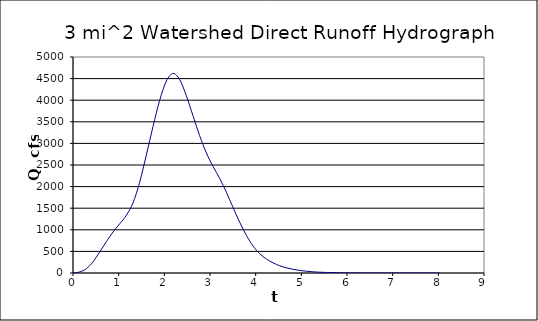
| Category | Series 0 |
|---|---|
| 0.0 | 0 |
| 0.146 | 24.152 |
| 0.292 | 99.024 |
| 0.438 | 258.428 |
| 0.584 | 483.043 |
| 0.73 | 724.564 |
| 0.876 | 949.179 |
| 1.022 | 1137.566 |
| 1.168 | 1335.187 |
| 1.314 | 1622.726 |
| 1.46 | 2101.989 |
| 1.606 | 2732.019 |
| 1.752 | 3391.217 |
| 1.898 | 3997.094 |
| 2.044 | 4442.36 |
| 2.19 | 4619.495 |
| 2.336 | 4477.637 |
| 2.4819999999999998 | 4103.023 |
| 2.628 | 3639.079 |
| 2.774 | 3178.132 |
| 2.92 | 2780.99 |
| 3.066 | 2469.483 |
| 3.212 | 2189.314 |
| 3.3579999999999997 | 1871.568 |
| 3.504 | 1517.978 |
| 3.65 | 1176.057 |
| 3.796 | 873.016 |
| 3.9419999999999997 | 625.488 |
| 4.087999999999999 | 448.507 |
| 4.233999999999998 | 324.532 |
| 4.379999999999997 | 235.144 |
| 4.525999999999996 | 168.667 |
| 4.671999999999995 | 120.433 |
| 4.817999999999994 | 85.274 |
| 4.963999999999993 | 59.444 |
| 5.109999999999992 | 40.807 |
| 5.255999999999991 | 27.491 |
| 5.40199999999999 | 18.43 |
| 5.547999999999989 | 12.821 |
| 5.693999999999988 | 8.814 |
| 5.839999999999987 | 5.876 |
| 5.985999999999986 | 3.526 |
| 6.1319999999999855 | 1.763 |
| 6.2779999999999845 | 0.588 |
| 6.4239999999999835 | 0 |
| 6.5699999999999825 | 0 |
| 6.7159999999999815 | 0 |
| 6.861999999999981 | 0 |
| 7.00799999999998 | 0 |
| 7.153999999999979 | 0 |
| 7.299999999999978 | 0 |
| 7.445999999999977 | 0 |
| 7.591999999999976 | 0 |
| 7.737999999999975 | 0 |
| 7.883999999999974 | 0 |
| 8.029999999999973 | 0 |